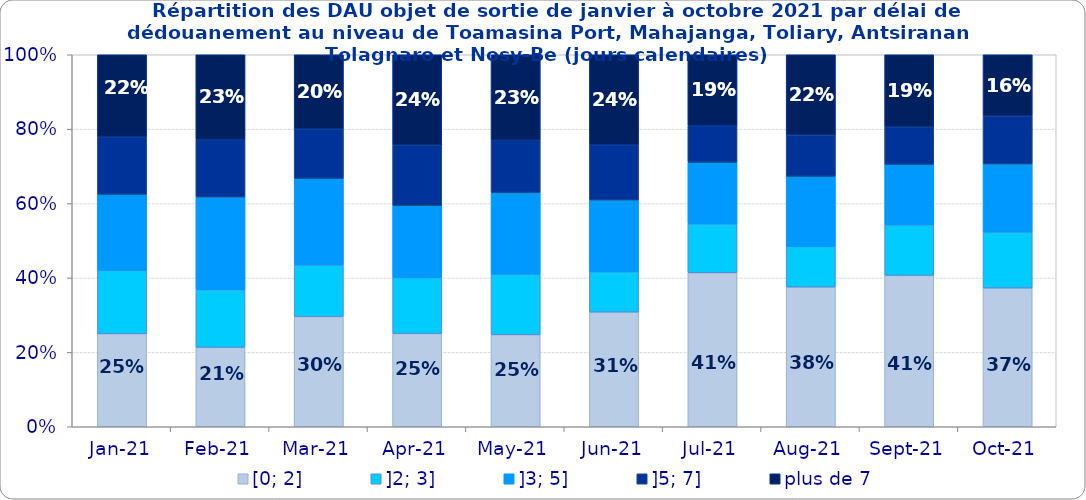
| Category | [0; 2] | ]2; 3] | ]3; 5] | ]5; 7] | plus de 7 |
|---|---|---|---|---|---|
| 2021-01-01 | 0.25 | 0.17 | 0.204 | 0.155 | 0.22 |
| 2021-02-01 | 0.213 | 0.155 | 0.249 | 0.155 | 0.228 |
| 2021-03-01 | 0.296 | 0.139 | 0.233 | 0.133 | 0.199 |
| 2021-04-01 | 0.25 | 0.151 | 0.194 | 0.162 | 0.243 |
| 2021-05-01 | 0.247 | 0.163 | 0.219 | 0.141 | 0.23 |
| 2021-06-01 | 0.308 | 0.108 | 0.193 | 0.149 | 0.242 |
| 2021-07-01 | 0.414 | 0.131 | 0.166 | 0.098 | 0.191 |
| 2021-08-01 | 0.376 | 0.109 | 0.188 | 0.112 | 0.215 |
| 2021-09-01 | 0.407 | 0.136 | 0.163 | 0.101 | 0.194 |
| 2021-10-01 | 0.373 | 0.15 | 0.183 | 0.129 | 0.164 |